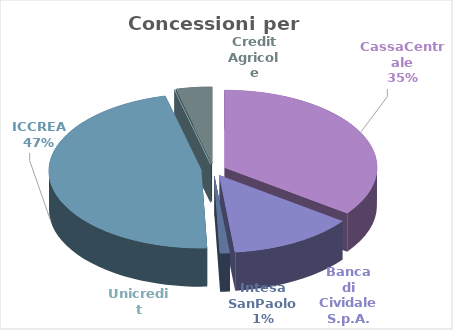
| Category | Series 0 |
|---|---|
| CassaCentrale | 10830200 |
| Banca di Cividale S.p.A. | 4093600 |
| Intesa SanPaolo  | 320000 |
| ICCREA | 14430480 |
| Unicredit | 0 |
| Credit Agricole | 1180000 |